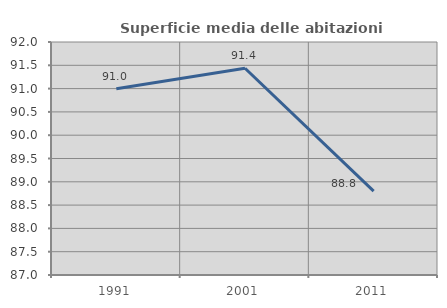
| Category | Superficie media delle abitazioni occupate |
|---|---|
| 1991.0 | 90.998 |
| 2001.0 | 91.436 |
| 2011.0 | 88.798 |